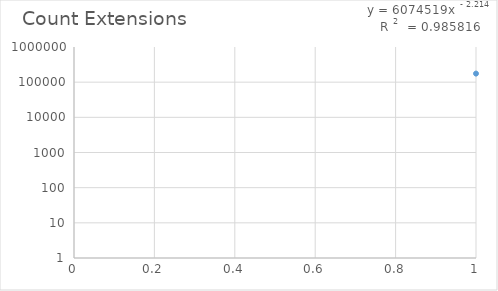
| Category | Count Extensions |
|---|---|
| 0 | 175368 |
| 1 | 114420 |
| 2 | 82498 |
| 3 | 80270 |
| 4 | 78363 |
| 5 | 64806 |
| 6 | 47915 |
| 7 | 36597 |
| 8 | 34673 |
| 9 | 33224 |
| 10 | 13245 |
| 11 | 13137 |
| 12 | 12166 |
| 13 | 9731 |
| 14 | 9179 |
| 15 | 7268 |
| 16 | 6956 |
| 17 | 6465 |
| 18 | 5406 |
| 19 | 5321 |
| 20 | 5096 |
| 21 | 4906 |
| 22 | 4270 |
| 23 | 3518 |
| 24 | 3196 |
| 25 | 3140 |
| 26 | 2876 |
| 27 | 2726 |
| 28 | 2657 |
| 29 | 2420 |
| 30 | 1994 |
| 31 | 1842 |
| 32 | 1759 |
| 33 | 1660 |
| 34 | 1634 |
| 35 | 1619 |
| 36 | 1560 |
| 37 | 1549 |
| 38 | 1521 |
| 39 | 1455 |
| 40 | 1326 |
| 41 | 1322 |
| 42 | 1224 |
| 43 | 1164 |
| 44 | 1141 |
| 45 | 1106 |
| 46 | 1106 |
| 47 | 1101 |
| 48 | 1058 |
| 49 | 952 |
| 50 | 935 |
| 51 | 922 |
| 52 | 902 |
| 53 | 882 |
| 54 | 852 |
| 55 | 845 |
| 56 | 837 |
| 57 | 796 |
| 58 | 785 |
| 59 | 766 |
| 60 | 732 |
| 61 | 691 |
| 62 | 685 |
| 63 | 650 |
| 64 | 650 |
| 65 | 627 |
| 66 | 612 |
| 67 | 598 |
| 68 | 589 |
| 69 | 574 |
| 70 | 561 |
| 71 | 559 |
| 72 | 533 |
| 73 | 531 |
| 74 | 526 |
| 75 | 469 |
| 76 | 453 |
| 77 | 446 |
| 78 | 436 |
| 79 | 424 |
| 80 | 423 |
| 81 | 420 |
| 82 | 418 |
| 83 | 415 |
| 84 | 412 |
| 85 | 409 |
| 86 | 397 |
| 87 | 394 |
| 88 | 393 |
| 89 | 388 |
| 90 | 388 |
| 91 | 383 |
| 92 | 383 |
| 93 | 380 |
| 94 | 377 |
| 95 | 363 |
| 96 | 357 |
| 97 | 350 |
| 98 | 348 |
| 99 | 347 |
| 100 | 341 |
| 101 | 338 |
| 102 | 332 |
| 103 | 325 |
| 104 | 316 |
| 105 | 313 |
| 106 | 312 |
| 107 | 308 |
| 108 | 306 |
| 109 | 305 |
| 110 | 304 |
| 111 | 302 |
| 112 | 295 |
| 113 | 292 |
| 114 | 288 |
| 115 | 286 |
| 116 | 272 |
| 117 | 261 |
| 118 | 260 |
| 119 | 255 |
| 120 | 253 |
| 121 | 241 |
| 122 | 240 |
| 123 | 239 |
| 124 | 235 |
| 125 | 228 |
| 126 | 227 |
| 127 | 222 |
| 128 | 219 |
| 129 | 209 |
| 130 | 202 |
| 131 | 200 |
| 132 | 197 |
| 133 | 197 |
| 134 | 185 |
| 135 | 183 |
| 136 | 180 |
| 137 | 179 |
| 138 | 169 |
| 139 | 168 |
| 140 | 166 |
| 141 | 165 |
| 142 | 164 |
| 143 | 159 |
| 144 | 153 |
| 145 | 152 |
| 146 | 149 |
| 147 | 146 |
| 148 | 142 |
| 149 | 140 |
| 150 | 140 |
| 151 | 134 |
| 152 | 133 |
| 153 | 123 |
| 154 | 122 |
| 155 | 122 |
| 156 | 118 |
| 157 | 118 |
| 158 | 114 |
| 159 | 114 |
| 160 | 112 |
| 161 | 110 |
| 162 | 109 |
| 163 | 109 |
| 164 | 106 |
| 165 | 106 |
| 166 | 105 |
| 167 | 100 |
| 168 | 100 |
| 169 | 99 |
| 170 | 97 |
| 171 | 96 |
| 172 | 95 |
| 173 | 94 |
| 174 | 91 |
| 175 | 88 |
| 176 | 88 |
| 177 | 86 |
| 178 | 83 |
| 179 | 82 |
| 180 | 82 |
| 181 | 81 |
| 182 | 81 |
| 183 | 80 |
| 184 | 78 |
| 185 | 78 |
| 186 | 77 |
| 187 | 76 |
| 188 | 74 |
| 189 | 72 |
| 190 | 72 |
| 191 | 71 |
| 192 | 70 |
| 193 | 70 |
| 194 | 70 |
| 195 | 70 |
| 196 | 70 |
| 197 | 69 |
| 198 | 68 |
| 199 | 68 |
| 200 | 67 |
| 201 | 65 |
| 202 | 64 |
| 203 | 62 |
| 204 | 62 |
| 205 | 61 |
| 206 | 61 |
| 207 | 60 |
| 208 | 60 |
| 209 | 59 |
| 210 | 58 |
| 211 | 56 |
| 212 | 55 |
| 213 | 55 |
| 214 | 55 |
| 215 | 54 |
| 216 | 54 |
| 217 | 54 |
| 218 | 52 |
| 219 | 52 |
| 220 | 51 |
| 221 | 51 |
| 222 | 48 |
| 223 | 47 |
| 224 | 47 |
| 225 | 46 |
| 226 | 46 |
| 227 | 46 |
| 228 | 45 |
| 229 | 45 |
| 230 | 44 |
| 231 | 44 |
| 232 | 44 |
| 233 | 44 |
| 234 | 43 |
| 235 | 42 |
| 236 | 42 |
| 237 | 42 |
| 238 | 42 |
| 239 | 41 |
| 240 | 41 |
| 241 | 40 |
| 242 | 40 |
| 243 | 39 |
| 244 | 39 |
| 245 | 38 |
| 246 | 38 |
| 247 | 38 |
| 248 | 38 |
| 249 | 38 |
| 250 | 37 |
| 251 | 37 |
| 252 | 37 |
| 253 | 36 |
| 254 | 36 |
| 255 | 36 |
| 256 | 35 |
| 257 | 34 |
| 258 | 34 |
| 259 | 33 |
| 260 | 33 |
| 261 | 33 |
| 262 | 32 |
| 263 | 32 |
| 264 | 31 |
| 265 | 30 |
| 266 | 30 |
| 267 | 30 |
| 268 | 30 |
| 269 | 30 |
| 270 | 30 |
| 271 | 30 |
| 272 | 29 |
| 273 | 29 |
| 274 | 29 |
| 275 | 28 |
| 276 | 28 |
| 277 | 27 |
| 278 | 27 |
| 279 | 27 |
| 280 | 26 |
| 281 | 26 |
| 282 | 26 |
| 283 | 26 |
| 284 | 26 |
| 285 | 26 |
| 286 | 26 |
| 287 | 25 |
| 288 | 25 |
| 289 | 25 |
| 290 | 25 |
| 291 | 25 |
| 292 | 24 |
| 293 | 24 |
| 294 | 24 |
| 295 | 24 |
| 296 | 24 |
| 297 | 24 |
| 298 | 24 |
| 299 | 23 |
| 300 | 23 |
| 301 | 23 |
| 302 | 23 |
| 303 | 22 |
| 304 | 22 |
| 305 | 22 |
| 306 | 22 |
| 307 | 22 |
| 308 | 21 |
| 309 | 21 |
| 310 | 21 |
| 311 | 21 |
| 312 | 21 |
| 313 | 21 |
| 314 | 20 |
| 315 | 20 |
| 316 | 20 |
| 317 | 20 |
| 318 | 20 |
| 319 | 20 |
| 320 | 20 |
| 321 | 20 |
| 322 | 20 |
| 323 | 19 |
| 324 | 19 |
| 325 | 19 |
| 326 | 19 |
| 327 | 19 |
| 328 | 19 |
| 329 | 19 |
| 330 | 19 |
| 331 | 19 |
| 332 | 19 |
| 333 | 18 |
| 334 | 18 |
| 335 | 18 |
| 336 | 18 |
| 337 | 18 |
| 338 | 18 |
| 339 | 18 |
| 340 | 18 |
| 341 | 17 |
| 342 | 17 |
| 343 | 17 |
| 344 | 17 |
| 345 | 17 |
| 346 | 17 |
| 347 | 16 |
| 348 | 16 |
| 349 | 16 |
| 350 | 16 |
| 351 | 16 |
| 352 | 16 |
| 353 | 16 |
| 354 | 16 |
| 355 | 16 |
| 356 | 16 |
| 357 | 15 |
| 358 | 15 |
| 359 | 15 |
| 360 | 15 |
| 361 | 15 |
| 362 | 15 |
| 363 | 15 |
| 364 | 15 |
| 365 | 15 |
| 366 | 15 |
| 367 | 14 |
| 368 | 14 |
| 369 | 14 |
| 370 | 14 |
| 371 | 14 |
| 372 | 14 |
| 373 | 14 |
| 374 | 14 |
| 375 | 14 |
| 376 | 14 |
| 377 | 14 |
| 378 | 13 |
| 379 | 13 |
| 380 | 13 |
| 381 | 13 |
| 382 | 13 |
| 383 | 13 |
| 384 | 13 |
| 385 | 13 |
| 386 | 12 |
| 387 | 12 |
| 388 | 12 |
| 389 | 12 |
| 390 | 12 |
| 391 | 12 |
| 392 | 12 |
| 393 | 12 |
| 394 | 11 |
| 395 | 11 |
| 396 | 11 |
| 397 | 11 |
| 398 | 11 |
| 399 | 11 |
| 400 | 11 |
| 401 | 11 |
| 402 | 11 |
| 403 | 11 |
| 404 | 11 |
| 405 | 11 |
| 406 | 10 |
| 407 | 10 |
| 408 | 10 |
| 409 | 10 |
| 410 | 10 |
| 411 | 10 |
| 412 | 10 |
| 413 | 10 |
| 414 | 10 |
| 415 | 10 |
| 416 | 10 |
| 417 | 10 |
| 418 | 10 |
| 419 | 10 |
| 420 | 10 |
| 421 | 10 |
| 422 | 9 |
| 423 | 9 |
| 424 | 9 |
| 425 | 9 |
| 426 | 9 |
| 427 | 9 |
| 428 | 9 |
| 429 | 9 |
| 430 | 9 |
| 431 | 9 |
| 432 | 9 |
| 433 | 9 |
| 434 | 9 |
| 435 | 9 |
| 436 | 9 |
| 437 | 8 |
| 438 | 8 |
| 439 | 8 |
| 440 | 8 |
| 441 | 8 |
| 442 | 8 |
| 443 | 8 |
| 444 | 8 |
| 445 | 8 |
| 446 | 8 |
| 447 | 8 |
| 448 | 8 |
| 449 | 8 |
| 450 | 8 |
| 451 | 8 |
| 452 | 8 |
| 453 | 8 |
| 454 | 8 |
| 455 | 8 |
| 456 | 8 |
| 457 | 8 |
| 458 | 8 |
| 459 | 8 |
| 460 | 8 |
| 461 | 8 |
| 462 | 8 |
| 463 | 8 |
| 464 | 8 |
| 465 | 7 |
| 466 | 7 |
| 467 | 7 |
| 468 | 7 |
| 469 | 7 |
| 470 | 7 |
| 471 | 7 |
| 472 | 7 |
| 473 | 7 |
| 474 | 7 |
| 475 | 7 |
| 476 | 7 |
| 477 | 7 |
| 478 | 7 |
| 479 | 7 |
| 480 | 7 |
| 481 | 7 |
| 482 | 7 |
| 483 | 7 |
| 484 | 7 |
| 485 | 7 |
| 486 | 7 |
| 487 | 7 |
| 488 | 6 |
| 489 | 6 |
| 490 | 6 |
| 491 | 6 |
| 492 | 6 |
| 493 | 6 |
| 494 | 6 |
| 495 | 6 |
| 496 | 6 |
| 497 | 6 |
| 498 | 6 |
| 499 | 6 |
| 500 | 6 |
| 501 | 6 |
| 502 | 6 |
| 503 | 6 |
| 504 | 6 |
| 505 | 6 |
| 506 | 6 |
| 507 | 6 |
| 508 | 6 |
| 509 | 6 |
| 510 | 6 |
| 511 | 6 |
| 512 | 6 |
| 513 | 6 |
| 514 | 6 |
| 515 | 6 |
| 516 | 6 |
| 517 | 6 |
| 518 | 6 |
| 519 | 6 |
| 520 | 6 |
| 521 | 6 |
| 522 | 6 |
| 523 | 6 |
| 524 | 6 |
| 525 | 6 |
| 526 | 6 |
| 527 | 5 |
| 528 | 5 |
| 529 | 5 |
| 530 | 5 |
| 531 | 5 |
| 532 | 5 |
| 533 | 5 |
| 534 | 5 |
| 535 | 5 |
| 536 | 5 |
| 537 | 5 |
| 538 | 5 |
| 539 | 5 |
| 540 | 5 |
| 541 | 5 |
| 542 | 5 |
| 543 | 5 |
| 544 | 5 |
| 545 | 5 |
| 546 | 5 |
| 547 | 5 |
| 548 | 5 |
| 549 | 5 |
| 550 | 5 |
| 551 | 5 |
| 552 | 5 |
| 553 | 5 |
| 554 | 5 |
| 555 | 5 |
| 556 | 4 |
| 557 | 4 |
| 558 | 4 |
| 559 | 4 |
| 560 | 4 |
| 561 | 4 |
| 562 | 4 |
| 563 | 4 |
| 564 | 4 |
| 565 | 4 |
| 566 | 4 |
| 567 | 4 |
| 568 | 4 |
| 569 | 4 |
| 570 | 4 |
| 571 | 4 |
| 572 | 4 |
| 573 | 4 |
| 574 | 4 |
| 575 | 4 |
| 576 | 4 |
| 577 | 4 |
| 578 | 4 |
| 579 | 4 |
| 580 | 4 |
| 581 | 4 |
| 582 | 4 |
| 583 | 4 |
| 584 | 4 |
| 585 | 4 |
| 586 | 4 |
| 587 | 4 |
| 588 | 4 |
| 589 | 4 |
| 590 | 4 |
| 591 | 4 |
| 592 | 4 |
| 593 | 4 |
| 594 | 4 |
| 595 | 4 |
| 596 | 4 |
| 597 | 4 |
| 598 | 4 |
| 599 | 4 |
| 600 | 4 |
| 601 | 4 |
| 602 | 4 |
| 603 | 4 |
| 604 | 4 |
| 605 | 4 |
| 606 | 4 |
| 607 | 4 |
| 608 | 4 |
| 609 | 4 |
| 610 | 4 |
| 611 | 4 |
| 612 | 4 |
| 613 | 4 |
| 614 | 4 |
| 615 | 4 |
| 616 | 4 |
| 617 | 4 |
| 618 | 4 |
| 619 | 4 |
| 620 | 4 |
| 621 | 4 |
| 622 | 4 |
| 623 | 4 |
| 624 | 4 |
| 625 | 4 |
| 626 | 4 |
| 627 | 4 |
| 628 | 4 |
| 629 | 4 |
| 630 | 4 |
| 631 | 4 |
| 632 | 4 |
| 633 | 4 |
| 634 | 4 |
| 635 | 4 |
| 636 | 4 |
| 637 | 4 |
| 638 | 4 |
| 639 | 4 |
| 640 | 4 |
| 641 | 4 |
| 642 | 4 |
| 643 | 4 |
| 644 | 4 |
| 645 | 4 |
| 646 | 4 |
| 647 | 3 |
| 648 | 3 |
| 649 | 3 |
| 650 | 3 |
| 651 | 3 |
| 652 | 3 |
| 653 | 3 |
| 654 | 3 |
| 655 | 3 |
| 656 | 3 |
| 657 | 3 |
| 658 | 3 |
| 659 | 3 |
| 660 | 3 |
| 661 | 3 |
| 662 | 3 |
| 663 | 3 |
| 664 | 3 |
| 665 | 3 |
| 666 | 3 |
| 667 | 3 |
| 668 | 3 |
| 669 | 3 |
| 670 | 3 |
| 671 | 3 |
| 672 | 3 |
| 673 | 3 |
| 674 | 3 |
| 675 | 3 |
| 676 | 3 |
| 677 | 3 |
| 678 | 3 |
| 679 | 3 |
| 680 | 3 |
| 681 | 3 |
| 682 | 3 |
| 683 | 3 |
| 684 | 3 |
| 685 | 3 |
| 686 | 3 |
| 687 | 3 |
| 688 | 3 |
| 689 | 3 |
| 690 | 3 |
| 691 | 3 |
| 692 | 3 |
| 693 | 3 |
| 694 | 3 |
| 695 | 2 |
| 696 | 2 |
| 697 | 2 |
| 698 | 2 |
| 699 | 2 |
| 700 | 2 |
| 701 | 2 |
| 702 | 2 |
| 703 | 2 |
| 704 | 2 |
| 705 | 2 |
| 706 | 2 |
| 707 | 2 |
| 708 | 2 |
| 709 | 2 |
| 710 | 2 |
| 711 | 2 |
| 712 | 2 |
| 713 | 2 |
| 714 | 2 |
| 715 | 2 |
| 716 | 2 |
| 717 | 2 |
| 718 | 2 |
| 719 | 2 |
| 720 | 2 |
| 721 | 2 |
| 722 | 2 |
| 723 | 2 |
| 724 | 2 |
| 725 | 2 |
| 726 | 2 |
| 727 | 2 |
| 728 | 2 |
| 729 | 2 |
| 730 | 2 |
| 731 | 2 |
| 732 | 2 |
| 733 | 2 |
| 734 | 2 |
| 735 | 2 |
| 736 | 2 |
| 737 | 2 |
| 738 | 2 |
| 739 | 2 |
| 740 | 2 |
| 741 | 2 |
| 742 | 2 |
| 743 | 2 |
| 744 | 2 |
| 745 | 2 |
| 746 | 2 |
| 747 | 2 |
| 748 | 2 |
| 749 | 2 |
| 750 | 2 |
| 751 | 2 |
| 752 | 2 |
| 753 | 2 |
| 754 | 2 |
| 755 | 2 |
| 756 | 2 |
| 757 | 2 |
| 758 | 2 |
| 759 | 2 |
| 760 | 2 |
| 761 | 2 |
| 762 | 2 |
| 763 | 2 |
| 764 | 2 |
| 765 | 2 |
| 766 | 2 |
| 767 | 2 |
| 768 | 2 |
| 769 | 2 |
| 770 | 2 |
| 771 | 2 |
| 772 | 2 |
| 773 | 2 |
| 774 | 2 |
| 775 | 2 |
| 776 | 2 |
| 777 | 2 |
| 778 | 2 |
| 779 | 2 |
| 780 | 2 |
| 781 | 2 |
| 782 | 2 |
| 783 | 2 |
| 784 | 2 |
| 785 | 2 |
| 786 | 2 |
| 787 | 2 |
| 788 | 2 |
| 789 | 2 |
| 790 | 2 |
| 791 | 2 |
| 792 | 2 |
| 793 | 2 |
| 794 | 2 |
| 795 | 2 |
| 796 | 2 |
| 797 | 2 |
| 798 | 2 |
| 799 | 2 |
| 800 | 2 |
| 801 | 2 |
| 802 | 2 |
| 803 | 2 |
| 804 | 2 |
| 805 | 2 |
| 806 | 2 |
| 807 | 2 |
| 808 | 2 |
| 809 | 2 |
| 810 | 2 |
| 811 | 2 |
| 812 | 2 |
| 813 | 2 |
| 814 | 2 |
| 815 | 2 |
| 816 | 2 |
| 817 | 2 |
| 818 | 2 |
| 819 | 2 |
| 820 | 2 |
| 821 | 2 |
| 822 | 2 |
| 823 | 2 |
| 824 | 2 |
| 825 | 2 |
| 826 | 2 |
| 827 | 2 |
| 828 | 2 |
| 829 | 2 |
| 830 | 2 |
| 831 | 2 |
| 832 | 2 |
| 833 | 2 |
| 834 | 2 |
| 835 | 2 |
| 836 | 2 |
| 837 | 2 |
| 838 | 2 |
| 839 | 2 |
| 840 | 2 |
| 841 | 2 |
| 842 | 2 |
| 843 | 2 |
| 844 | 2 |
| 845 | 2 |
| 846 | 2 |
| 847 | 2 |
| 848 | 2 |
| 849 | 2 |
| 850 | 2 |
| 851 | 2 |
| 852 | 2 |
| 853 | 2 |
| 854 | 2 |
| 855 | 2 |
| 856 | 2 |
| 857 | 2 |
| 858 | 2 |
| 859 | 2 |
| 860 | 2 |
| 861 | 2 |
| 862 | 2 |
| 863 | 2 |
| 864 | 2 |
| 865 | 2 |
| 866 | 2 |
| 867 | 2 |
| 868 | 2 |
| 869 | 2 |
| 870 | 2 |
| 871 | 2 |
| 872 | 2 |
| 873 | 2 |
| 874 | 2 |
| 875 | 2 |
| 876 | 2 |
| 877 | 2 |
| 878 | 2 |
| 879 | 2 |
| 880 | 2 |
| 881 | 2 |
| 882 | 2 |
| 883 | 2 |
| 884 | 2 |
| 885 | 2 |
| 886 | 2 |
| 887 | 2 |
| 888 | 2 |
| 889 | 2 |
| 890 | 2 |
| 891 | 2 |
| 892 | 2 |
| 893 | 2 |
| 894 | 2 |
| 895 | 2 |
| 896 | 2 |
| 897 | 2 |
| 898 | 2 |
| 899 | 2 |
| 900 | 2 |
| 901 | 2 |
| 902 | 2 |
| 903 | 2 |
| 904 | 2 |
| 905 | 2 |
| 906 | 2 |
| 907 | 2 |
| 908 | 2 |
| 909 | 2 |
| 910 | 2 |
| 911 | 2 |
| 912 | 2 |
| 913 | 2 |
| 914 | 2 |
| 915 | 2 |
| 916 | 2 |
| 917 | 2 |
| 918 | 2 |
| 919 | 2 |
| 920 | 2 |
| 921 | 2 |
| 922 | 2 |
| 923 | 2 |
| 924 | 2 |
| 925 | 2 |
| 926 | 2 |
| 927 | 2 |
| 928 | 2 |
| 929 | 2 |
| 930 | 2 |
| 931 | 2 |
| 932 | 2 |
| 933 | 2 |
| 934 | 2 |
| 935 | 1 |
| 936 | 1 |
| 937 | 1 |
| 938 | 1 |
| 939 | 1 |
| 940 | 1 |
| 941 | 1 |
| 942 | 1 |
| 943 | 1 |
| 944 | 1 |
| 945 | 1 |
| 946 | 1 |
| 947 | 1 |
| 948 | 1 |
| 949 | 1 |
| 950 | 1 |
| 951 | 1 |
| 952 | 1 |
| 953 | 1 |
| 954 | 1 |
| 955 | 1 |
| 956 | 1 |
| 957 | 1 |
| 958 | 1 |
| 959 | 1 |
| 960 | 1 |
| 961 | 1 |
| 962 | 1 |
| 963 | 1 |
| 964 | 1 |
| 965 | 1 |
| 966 | 1 |
| 967 | 1 |
| 968 | 1 |
| 969 | 1 |
| 970 | 1 |
| 971 | 1 |
| 972 | 1 |
| 973 | 1 |
| 974 | 1 |
| 975 | 1 |
| 976 | 1 |
| 977 | 1 |
| 978 | 1 |
| 979 | 1 |
| 980 | 1 |
| 981 | 1 |
| 982 | 1 |
| 983 | 1 |
| 984 | 1 |
| 985 | 1 |
| 986 | 1 |
| 987 | 1 |
| 988 | 1 |
| 989 | 1 |
| 990 | 1 |
| 991 | 1 |
| 992 | 1 |
| 993 | 1 |
| 994 | 1 |
| 995 | 1 |
| 996 | 1 |
| 997 | 1 |
| 998 | 1 |
| 999 | 1 |
| 1000 | 1 |
| 1001 | 1 |
| 1002 | 1 |
| 1003 | 1 |
| 1004 | 1 |
| 1005 | 1 |
| 1006 | 1 |
| 1007 | 1 |
| 1008 | 1 |
| 1009 | 1 |
| 1010 | 1 |
| 1011 | 1 |
| 1012 | 1 |
| 1013 | 1 |
| 1014 | 1 |
| 1015 | 1 |
| 1016 | 1 |
| 1017 | 1 |
| 1018 | 1 |
| 1019 | 1 |
| 1020 | 1 |
| 1021 | 1 |
| 1022 | 1 |
| 1023 | 1 |
| 1024 | 1 |
| 1025 | 1 |
| 1026 | 1 |
| 1027 | 1 |
| 1028 | 1 |
| 1029 | 1 |
| 1030 | 1 |
| 1031 | 1 |
| 1032 | 1 |
| 1033 | 1 |
| 1034 | 1 |
| 1035 | 1 |
| 1036 | 1 |
| 1037 | 1 |
| 1038 | 1 |
| 1039 | 1 |
| 1040 | 1 |
| 1041 | 1 |
| 1042 | 1 |
| 1043 | 1 |
| 1044 | 1 |
| 1045 | 1 |
| 1046 | 1 |
| 1047 | 1 |
| 1048 | 1 |
| 1049 | 1 |
| 1050 | 1 |
| 1051 | 1 |
| 1052 | 1 |
| 1053 | 1 |
| 1054 | 1 |
| 1055 | 1 |
| 1056 | 1 |
| 1057 | 1 |
| 1058 | 1 |
| 1059 | 1 |
| 1060 | 1 |
| 1061 | 1 |
| 1062 | 1 |
| 1063 | 1 |
| 1064 | 1 |
| 1065 | 1 |
| 1066 | 1 |
| 1067 | 1 |
| 1068 | 1 |
| 1069 | 1 |
| 1070 | 1 |
| 1071 | 1 |
| 1072 | 1 |
| 1073 | 1 |
| 1074 | 1 |
| 1075 | 1 |
| 1076 | 1 |
| 1077 | 1 |
| 1078 | 1 |
| 1079 | 1 |
| 1080 | 1 |
| 1081 | 1 |
| 1082 | 1 |
| 1083 | 1 |
| 1084 | 1 |
| 1085 | 1 |
| 1086 | 1 |
| 1087 | 1 |
| 1088 | 1 |
| 1089 | 1 |
| 1090 | 1 |
| 1091 | 1 |
| 1092 | 1 |
| 1093 | 1 |
| 1094 | 1 |
| 1095 | 1 |
| 1096 | 1 |
| 1097 | 1 |
| 1098 | 1 |
| 1099 | 1 |
| 1100 | 1 |
| 1101 | 1 |
| 1102 | 1 |
| 1103 | 1 |
| 1104 | 1 |
| 1105 | 1 |
| 1106 | 1 |
| 1107 | 1 |
| 1108 | 1 |
| 1109 | 1 |
| 1110 | 1 |
| 1111 | 1 |
| 1112 | 1 |
| 1113 | 1 |
| 1114 | 1 |
| 1115 | 1 |
| 1116 | 1 |
| 1117 | 1 |
| 1118 | 1 |
| 1119 | 1 |
| 1120 | 1 |
| 1121 | 1 |
| 1122 | 1 |
| 1123 | 1 |
| 1124 | 1 |
| 1125 | 1 |
| 1126 | 1 |
| 1127 | 1 |
| 1128 | 1 |
| 1129 | 1 |
| 1130 | 1 |
| 1131 | 1 |
| 1132 | 1 |
| 1133 | 1 |
| 1134 | 1 |
| 1135 | 1 |
| 1136 | 1 |
| 1137 | 1 |
| 1138 | 1 |
| 1139 | 1 |
| 1140 | 1 |
| 1141 | 1 |
| 1142 | 1 |
| 1143 | 1 |
| 1144 | 1 |
| 1145 | 1 |
| 1146 | 1 |
| 1147 | 1 |
| 1148 | 1 |
| 1149 | 1 |
| 1150 | 1 |
| 1151 | 1 |
| 1152 | 1 |
| 1153 | 1 |
| 1154 | 1 |
| 1155 | 1 |
| 1156 | 1 |
| 1157 | 1 |
| 1158 | 1 |
| 1159 | 1 |
| 1160 | 1 |
| 1161 | 1 |
| 1162 | 1 |
| 1163 | 1 |
| 1164 | 1 |
| 1165 | 1 |
| 1166 | 1 |
| 1167 | 1 |
| 1168 | 1 |
| 1169 | 1 |
| 1170 | 1 |
| 1171 | 1 |
| 1172 | 1 |
| 1173 | 1 |
| 1174 | 1 |
| 1175 | 1 |
| 1176 | 1 |
| 1177 | 1 |
| 1178 | 1 |
| 1179 | 1 |
| 1180 | 1 |
| 1181 | 1 |
| 1182 | 1 |
| 1183 | 1 |
| 1184 | 1 |
| 1185 | 1 |
| 1186 | 1 |
| 1187 | 1 |
| 1188 | 1 |
| 1189 | 1 |
| 1190 | 1 |
| 1191 | 1 |
| 1192 | 1 |
| 1193 | 1 |
| 1194 | 1 |
| 1195 | 1 |
| 1196 | 1 |
| 1197 | 1 |
| 1198 | 1 |
| 1199 | 1 |
| 1200 | 1 |
| 1201 | 1 |
| 1202 | 1 |
| 1203 | 1 |
| 1204 | 1 |
| 1205 | 1 |
| 1206 | 1 |
| 1207 | 1 |
| 1208 | 1 |
| 1209 | 1 |
| 1210 | 1 |
| 1211 | 1 |
| 1212 | 1 |
| 1213 | 1 |
| 1214 | 1 |
| 1215 | 1 |
| 1216 | 1 |
| 1217 | 1 |
| 1218 | 1 |
| 1219 | 1 |
| 1220 | 1 |
| 1221 | 1 |
| 1222 | 1 |
| 1223 | 1 |
| 1224 | 1 |
| 1225 | 1 |
| 1226 | 1 |
| 1227 | 1 |
| 1228 | 1 |
| 1229 | 1 |
| 1230 | 1 |
| 1231 | 1 |
| 1232 | 1 |
| 1233 | 1 |
| 1234 | 1 |
| 1235 | 1 |
| 1236 | 1 |
| 1237 | 1 |
| 1238 | 1 |
| 1239 | 1 |
| 1240 | 1 |
| 1241 | 1 |
| 1242 | 1 |
| 1243 | 1 |
| 1244 | 1 |
| 1245 | 1 |
| 1246 | 1 |
| 1247 | 1 |
| 1248 | 1 |
| 1249 | 1 |
| 1250 | 1 |
| 1251 | 1 |
| 1252 | 1 |
| 1253 | 1 |
| 1254 | 1 |
| 1255 | 1 |
| 1256 | 1 |
| 1257 | 1 |
| 1258 | 1 |
| 1259 | 1 |
| 1260 | 1 |
| 1261 | 1 |
| 1262 | 1 |
| 1263 | 1 |
| 1264 | 1 |
| 1265 | 1 |
| 1266 | 1 |
| 1267 | 1 |
| 1268 | 1 |
| 1269 | 1 |
| 1270 | 1 |
| 1271 | 1 |
| 1272 | 1 |
| 1273 | 1 |
| 1274 | 1 |
| 1275 | 1 |
| 1276 | 1 |
| 1277 | 1 |
| 1278 | 1 |
| 1279 | 1 |
| 1280 | 1 |
| 1281 | 1 |
| 1282 | 1 |
| 1283 | 1 |
| 1284 | 1 |
| 1285 | 1 |
| 1286 | 1 |
| 1287 | 1 |
| 1288 | 1 |
| 1289 | 1 |
| 1290 | 1 |
| 1291 | 1 |
| 1292 | 1 |
| 1293 | 1 |
| 1294 | 1 |
| 1295 | 1 |
| 1296 | 1 |
| 1297 | 1 |
| 1298 | 1 |
| 1299 | 1 |
| 1300 | 1 |
| 1301 | 1 |
| 1302 | 1 |
| 1303 | 1 |
| 1304 | 1 |
| 1305 | 1 |
| 1306 | 1 |
| 1307 | 1 |
| 1308 | 1 |
| 1309 | 1 |
| 1310 | 1 |
| 1311 | 1 |
| 1312 | 1 |
| 1313 | 1 |
| 1314 | 1 |
| 1315 | 1 |
| 1316 | 1 |
| 1317 | 1 |
| 1318 | 1 |
| 1319 | 1 |
| 1320 | 1 |
| 1321 | 1 |
| 1322 | 1 |
| 1323 | 1 |
| 1324 | 1 |
| 1325 | 1 |
| 1326 | 1 |
| 1327 | 1 |
| 1328 | 1 |
| 1329 | 1 |
| 1330 | 1 |
| 1331 | 1 |
| 1332 | 1 |
| 1333 | 1 |
| 1334 | 1 |
| 1335 | 1 |
| 1336 | 1 |